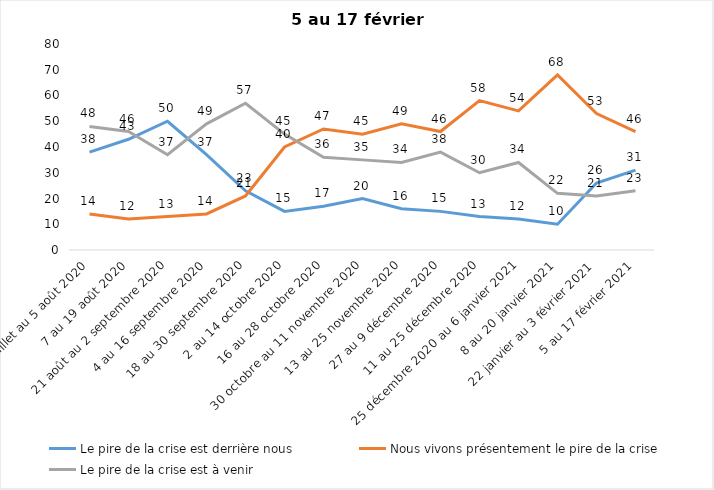
| Category | Le pire de la crise est derrière nous | Nous vivons présentement le pire de la crise | Le pire de la crise est à venir |
|---|---|---|---|
| 24 juillet au 5 août 2020 | 38 | 14 | 48 |
| 7 au 19 août 2020 | 43 | 12 | 46 |
| 21 août au 2 septembre 2020 | 50 | 13 | 37 |
| 4 au 16 septembre 2020 | 37 | 14 | 49 |
| 18 au 30 septembre 2020 | 23 | 21 | 57 |
| 2 au 14 octobre 2020 | 15 | 40 | 45 |
| 16 au 28 octobre 2020 | 17 | 47 | 36 |
| 30 octobre au 11 novembre 2020 | 20 | 45 | 35 |
| 13 au 25 novembre 2020 | 16 | 49 | 34 |
| 27 au 9 décembre 2020 | 15 | 46 | 38 |
| 11 au 25 décembre 2020 | 13 | 58 | 30 |
| 25 décembre 2020 au 6 janvier 2021 | 12 | 54 | 34 |
| 8 au 20 janvier 2021 | 10 | 68 | 22 |
| 22 janvier au 3 février 2021 | 26 | 53 | 21 |
| 5 au 17 février 2021 | 31 | 46 | 23 |